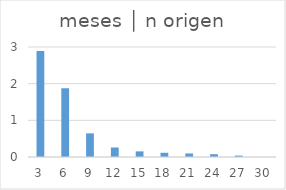
| Category | meses │ n origen |
|---|---|
| 3.0 | 2.894 |
| 6.0 | 1.875 |
| 9.0 | 0.644 |
| 12.0 | 0.26 |
| 15.0 | 0.154 |
| 18.0 | 0.115 |
| 21.0 | 0.096 |
| 24.0 | 0.077 |
| 27.0 | 0.038 |
| 30.0 | 0 |